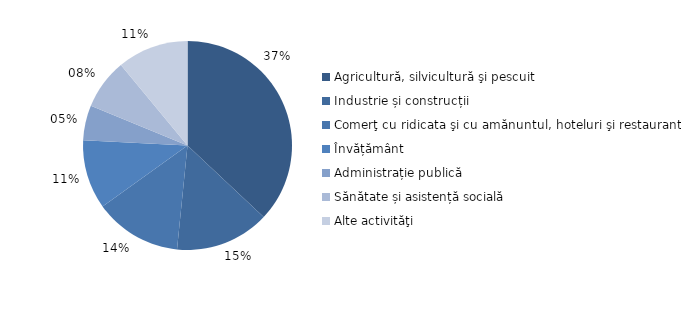
| Category | Series 0 |
|---|---|
| Agricultură, silvicultură şi pescuit | 37 |
| Industrie și construcții | 14.6 |
| Comerţ cu ridicata şi cu amănuntul, hoteluri şi restaurante | 13.5 |
| Învățământ | 10.7 |
| Administrație publică | 5.4 |
| Sănătate și asistență socială | 7.8 |
| Alte activităţi | 11 |